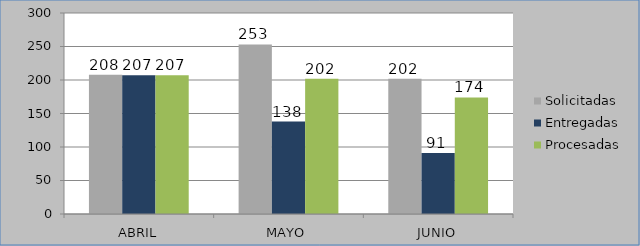
| Category | Solicitadas | Entregadas | Procesadas |
|---|---|---|---|
| ABRIL | 208 | 207 | 207 |
| MAYO | 253 | 138 | 202 |
| JUNIO | 202 | 91 | 174 |